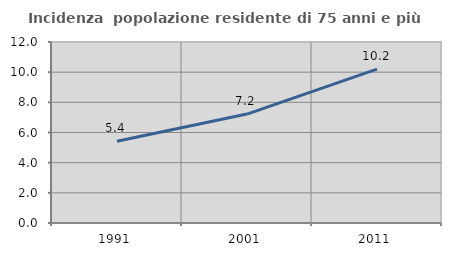
| Category | Incidenza  popolazione residente di 75 anni e più |
|---|---|
| 1991.0 | 5.416 |
| 2001.0 | 7.222 |
| 2011.0 | 10.2 |